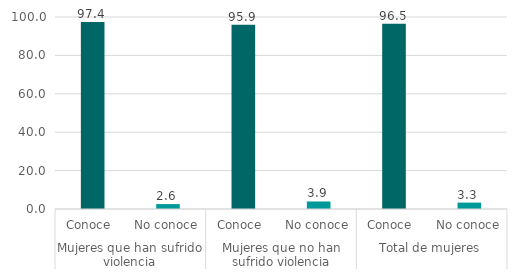
| Category | % de mujeres |
|---|---|
| 0 | 97.373 |
| 1 | 2.561 |
| 2 | 95.9 |
| 3 | 3.916 |
| 4 | 96.539 |
| 5 | 3.329 |